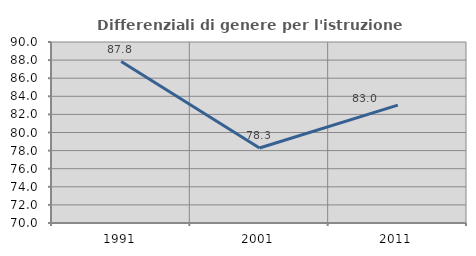
| Category | Differenziali di genere per l'istruzione superiore |
|---|---|
| 1991.0 | 87.836 |
| 2001.0 | 78.285 |
| 2011.0 | 83.031 |